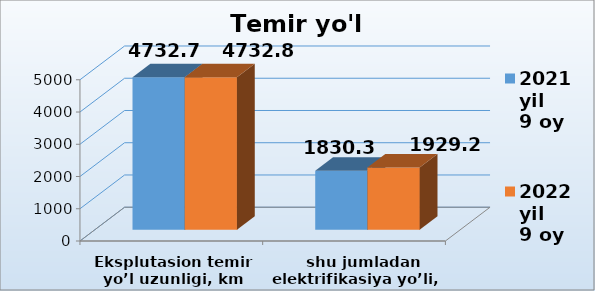
| Category | 2021 yil    
9 oy | 2022 yil    
9 oy |
|---|---|---|
| Eksplutasion temir yo’l uzunligi, km | 4732.7 | 4732.8 |
|    shu jumladan elektrifikasiya yo’li, km | 1830.3 | 1929.21 |